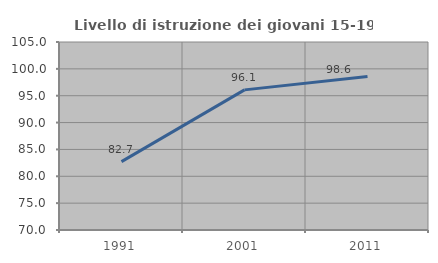
| Category | Livello di istruzione dei giovani 15-19 anni |
|---|---|
| 1991.0 | 82.735 |
| 2001.0 | 96.088 |
| 2011.0 | 98.58 |